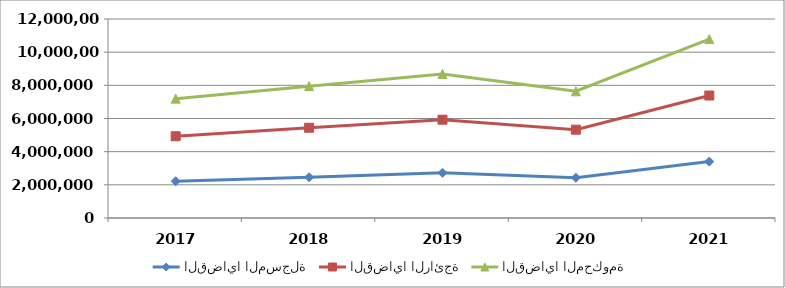
| Category | القضايا المسجلة | القضايا الرائجة | القضايا المحكومة |
|---|---|---|---|
| 2017.0 | 2214833 | 2714704 | 2266789 |
| 2018.0 | 2455457 | 2985931 | 2509918 |
| 2019.0 | 2725834 | 3203085 | 2754326 |
| 2020.0 | 2427489 | 2897920 | 2316741 |
| 2021.0 | 3402023 | 3983264 | 3406846 |